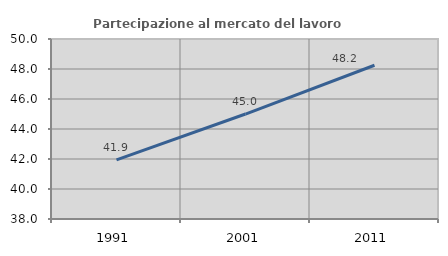
| Category | Partecipazione al mercato del lavoro  femminile |
|---|---|
| 1991.0 | 41.947 |
| 2001.0 | 44.998 |
| 2011.0 | 48.249 |